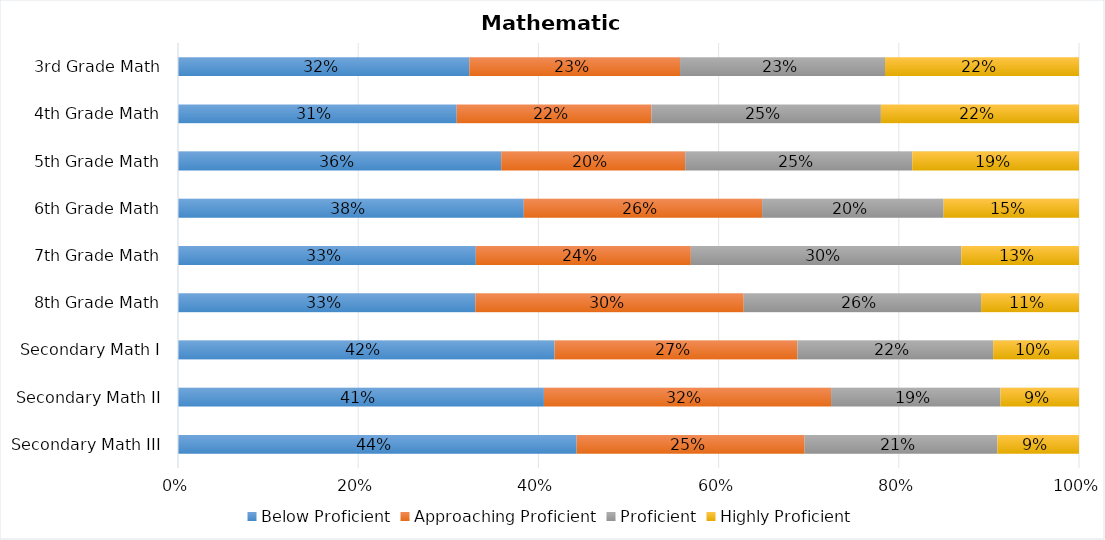
| Category | Below Proficient | Approaching Proficient | Proficient | Highly Proficient |
|---|---|---|---|---|
| Secondary Math III | 0.442 | 0.253 | 0.214 | 0.09 |
| Secondary Math II | 0.406 | 0.319 | 0.188 | 0.087 |
| Secondary Math I | 0.418 | 0.27 | 0.217 | 0.095 |
| 8th Grade Math | 0.33 | 0.298 | 0.263 | 0.109 |
| 7th Grade Math | 0.331 | 0.239 | 0.3 | 0.131 |
| 6th Grade Math | 0.384 | 0.264 | 0.202 | 0.15 |
| 5th Grade Math | 0.359 | 0.204 | 0.252 | 0.185 |
| 4th Grade Math | 0.309 | 0.216 | 0.255 | 0.22 |
| 3rd Grade Math | 0.323 | 0.234 | 0.228 | 0.215 |